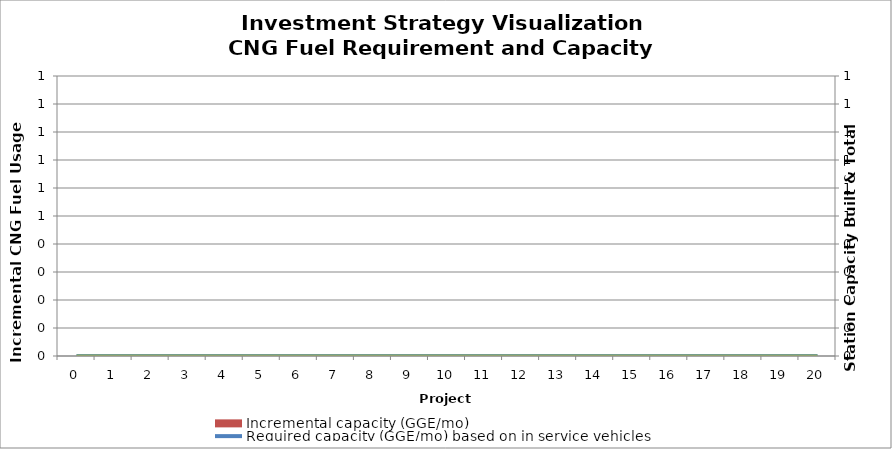
| Category | Incremental capacity (GGE/mo) |
|---|---|
| 0.0 | 0 |
| 1.0 | 0 |
| 2.0 | 0 |
| 3.0 | 0 |
| 4.0 | 0 |
| 5.0 | 0 |
| 6.0 | 0 |
| 7.0 | 0 |
| 8.0 | 0 |
| 9.0 | 0 |
| 10.0 | 0 |
| 11.0 | 0 |
| 12.0 | 0 |
| 13.0 | 0 |
| 14.0 | 0 |
| 15.0 | 0 |
| 16.0 | 0 |
| 17.0 | 0 |
| 18.0 | 0 |
| 19.0 | 0 |
| 20.0 | 0 |